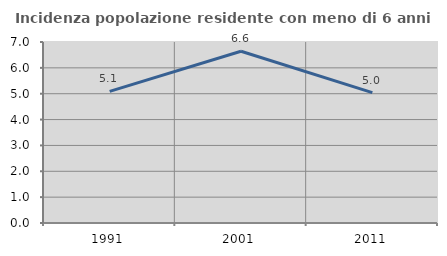
| Category | Incidenza popolazione residente con meno di 6 anni |
|---|---|
| 1991.0 | 5.09 |
| 2001.0 | 6.641 |
| 2011.0 | 5.044 |